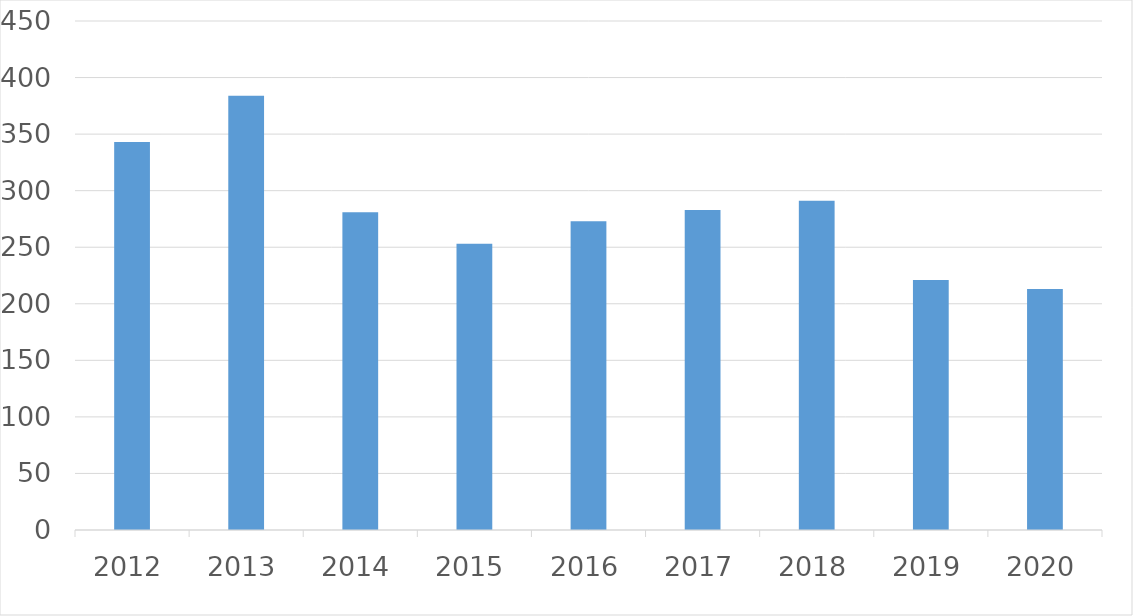
| Category | Series 0 |
|---|---|
| 2012 | 343 |
| 2013 | 384 |
| 2014 | 281 |
| 2015 | 253 |
| 2016 | 273 |
| 2017 | 283 |
| 2018 | 291 |
| 2019 | 221 |
| 2020 | 213 |